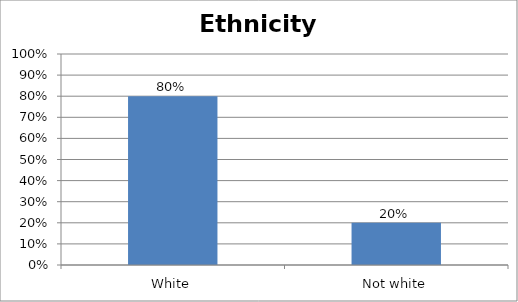
| Category | Series 0 |
|---|---|
| White | 0.8 |
| Not white | 0.2 |